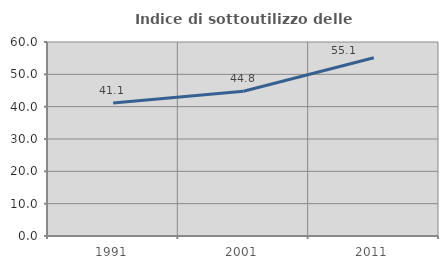
| Category | Indice di sottoutilizzo delle abitazioni  |
|---|---|
| 1991.0 | 41.142 |
| 2001.0 | 44.792 |
| 2011.0 | 55.132 |